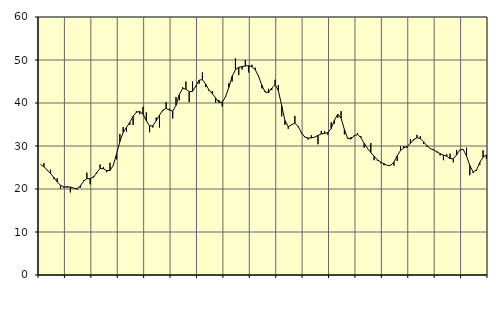
| Category | Piggar | Series 1 |
|---|---|---|
| nan | 25.7 | 25.68 |
| 87.0 | 26 | 25.17 |
| 87.0 | 24.3 | 24.44 |
| 87.0 | 24.5 | 23.59 |
| nan | 22.3 | 22.7 |
| 88.0 | 22.5 | 21.66 |
| 88.0 | 20.1 | 20.87 |
| 88.0 | 20.3 | 20.48 |
| nan | 20.7 | 20.45 |
| 89.0 | 19.2 | 20.46 |
| 89.0 | 20.2 | 20.21 |
| 89.0 | 19.9 | 20.07 |
| nan | 20.3 | 20.69 |
| 90.0 | 22 | 21.79 |
| 90.0 | 23.8 | 22.41 |
| 90.0 | 21.1 | 22.42 |
| nan | 23 | 22.73 |
| 91.0 | 23.6 | 23.86 |
| 91.0 | 25.7 | 24.78 |
| 91.0 | 25.1 | 24.72 |
| nan | 23.9 | 24.28 |
| 92.0 | 26.1 | 24.29 |
| 92.0 | 25.6 | 25.54 |
| 92.0 | 26.9 | 28.16 |
| nan | 32.8 | 31.06 |
| 93.0 | 34.4 | 33.16 |
| 93.0 | 33.3 | 34.34 |
| 93.0 | 34.9 | 35.5 |
| nan | 34.9 | 36.93 |
| 94.0 | 38.1 | 37.84 |
| 94.0 | 37.4 | 38.04 |
| 94.0 | 39.1 | 37.39 |
| nan | 37.8 | 35.9 |
| 95.0 | 33.2 | 34.66 |
| 95.0 | 34.3 | 34.73 |
| 95.0 | 36.6 | 35.85 |
| nan | 34.3 | 37.19 |
| 96.0 | 38.1 | 38.33 |
| 96.0 | 40.2 | 38.74 |
| 96.0 | 38.7 | 38.36 |
| nan | 36.4 | 38.13 |
| 97.0 | 41.4 | 39.45 |
| 97.0 | 40.6 | 41.94 |
| 97.0 | 43.7 | 43.39 |
| nan | 45 | 43.24 |
| 98.0 | 40.2 | 42.63 |
| 98.0 | 45 | 42.69 |
| 98.0 | 43.7 | 43.94 |
| nan | 44.5 | 45.31 |
| 99.0 | 47.1 | 45.44 |
| 99.0 | 43.7 | 44.38 |
| 99.0 | 42.8 | 43.01 |
| nan | 42.8 | 42.16 |
| 0.0 | 40.1 | 41.18 |
| 0.0 | 40.7 | 40.15 |
| 0.0 | 39.2 | 40.2 |
| nan | 41.6 | 41.43 |
| 1.0 | 44.6 | 43.65 |
| 1.0 | 45 | 46.2 |
| 1.0 | 50.4 | 47.74 |
| nan | 46.5 | 48.3 |
| 2.0 | 47.8 | 48.45 |
| 2.0 | 50 | 48.6 |
| 2.0 | 47.1 | 48.68 |
| nan | 48.9 | 48.42 |
| 3.0 | 48.2 | 47.76 |
| 3.0 | 46.1 | 46.22 |
| 3.0 | 43.4 | 44.13 |
| nan | 42.7 | 42.54 |
| 4.0 | 43.3 | 42.42 |
| 4.0 | 43 | 43.49 |
| 4.0 | 45.4 | 44.22 |
| nan | 44.2 | 42.9 |
| 5.0 | 36.9 | 39.4 |
| 5.0 | 34.9 | 35.95 |
| 5.0 | 34 | 34.48 |
| nan | 35 | 34.93 |
| 6.0 | 37 | 35.34 |
| 6.0 | 34.4 | 34.53 |
| 6.0 | 32.8 | 33.07 |
| nan | 32.2 | 32.07 |
| 7.0 | 31.5 | 31.86 |
| 7.0 | 32.5 | 31.89 |
| 7.0 | 32 | 32.06 |
| nan | 30.4 | 32.45 |
| 8.0 | 33.5 | 32.81 |
| 8.0 | 33.5 | 32.94 |
| 8.0 | 32.6 | 33.12 |
| nan | 35.5 | 34.07 |
| 9.0 | 35.2 | 36.03 |
| 9.0 | 36.6 | 37.38 |
| 9.0 | 38.1 | 36.45 |
| nan | 32.7 | 33.86 |
| 10.0 | 31.9 | 31.78 |
| 10.0 | 32.1 | 31.63 |
| 10.0 | 32.3 | 32.43 |
| nan | 33 | 32.66 |
| 11.0 | 32.3 | 31.95 |
| 11.0 | 29.6 | 30.61 |
| 11.0 | 29.3 | 29.42 |
| nan | 30.7 | 28.5 |
| 12.0 | 26.7 | 27.62 |
| 12.0 | 26.6 | 26.8 |
| 12.0 | 26 | 26.25 |
| nan | 25.5 | 25.86 |
| 13.0 | 25.5 | 25.48 |
| 13.0 | 25.6 | 25.49 |
| 13.0 | 25.4 | 26.27 |
| nan | 26.5 | 27.71 |
| 14.0 | 29.9 | 28.97 |
| 14.0 | 30 | 29.56 |
| 14.0 | 29.6 | 29.87 |
| nan | 31.6 | 30.61 |
| 15.0 | 31.3 | 31.52 |
| 15.0 | 32.6 | 31.93 |
| 15.0 | 32.3 | 31.71 |
| nan | 30.5 | 30.96 |
| 16.0 | 29.8 | 30.08 |
| 16.0 | 29.4 | 29.42 |
| 16.0 | 29.2 | 29.07 |
| nan | 28.5 | 28.71 |
| 17.0 | 27.8 | 28.21 |
| 17.0 | 26.7 | 27.89 |
| 17.0 | 28.1 | 27.62 |
| nan | 28.2 | 27.08 |
| 18.0 | 26.2 | 27.03 |
| 18.0 | 29.1 | 27.95 |
| 18.0 | 29.1 | 29.12 |
| nan | 29.2 | 29.2 |
| 19.0 | 29.6 | 27.64 |
| 19.0 | 23.2 | 25.46 |
| 19.0 | 23.7 | 23.98 |
| nan | 24.2 | 24.39 |
| 20.0 | 25.6 | 26.12 |
| 20.0 | 29 | 27.41 |
| 20.0 | 27 | 27.92 |